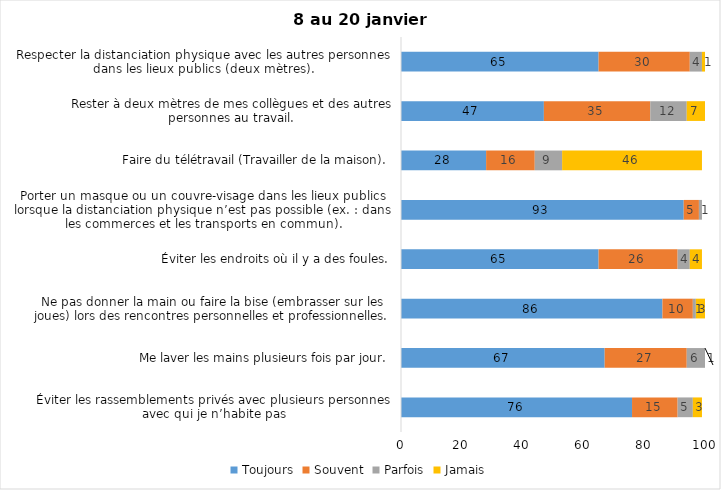
| Category | Toujours | Souvent | Parfois | Jamais |
|---|---|---|---|---|
| Éviter les rassemblements privés avec plusieurs personnes avec qui je n’habite pas | 76 | 15 | 5 | 3 |
| Me laver les mains plusieurs fois par jour. | 67 | 27 | 6 | 1 |
| Ne pas donner la main ou faire la bise (embrasser sur les joues) lors des rencontres personnelles et professionnelles. | 86 | 10 | 1 | 3 |
| Éviter les endroits où il y a des foules. | 65 | 26 | 4 | 4 |
| Porter un masque ou un couvre-visage dans les lieux publics lorsque la distanciation physique n’est pas possible (ex. : dans les commerces et les transports en commun). | 93 | 5 | 1 | 0 |
| Faire du télétravail (Travailler de la maison). | 28 | 16 | 9 | 46 |
| Rester à deux mètres de mes collègues et des autres personnes au travail. | 47 | 35 | 12 | 7 |
| Respecter la distanciation physique avec les autres personnes dans les lieux publics (deux mètres). | 65 | 30 | 4 | 1 |